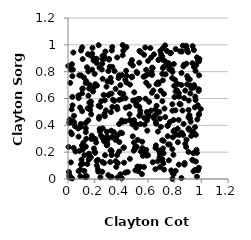
| Category | Series 0 |
|---|---|
| 0.7836342504068851 | 0.047 |
| 0.5610615064754484 | 0.173 |
| 0.04253485079842576 | 0.232 |
| 0.919891491295028 | 0.428 |
| 0.9515869209305778 | 0.534 |
| 0.5205785303169262 | 0.093 |
| 0.3262155400384781 | 0.637 |
| 0.6446854060187953 | 0.929 |
| 0.535160524778381 | 0.538 |
| 0.5935872876621674 | 0.779 |
| 0.534909024585252 | 0.471 |
| 0.2595380502048091 | 0.747 |
| 0.8655837116887714 | 0.839 |
| 0.13361825662190904 | 0.35 |
| 0.6056085689123091 | 0.695 |
| 0.20532825203499436 | 0.297 |
| 0.1688141165076407 | 0.57 |
| 0.10783027642858285 | 0.672 |
| 0.8670050182637795 | 0.41 |
| 0.2764689434769459 | 0.586 |
| 0.13324119266326725 | 0.418 |
| 0.9051945486520051 | 0.585 |
| 0.25927888224184875 | 0.891 |
| 0.1350354829395176 | 0.013 |
| 0.8743601571822789 | 0.12 |
| 0.032825821279329315 | 0.767 |
| 0.30267499963031913 | 0.625 |
| 0.35803701581496883 | 0.133 |
| 0.5424560325676623 | 0.091 |
| 0.37026893233019714 | 0.519 |
| 0.7836252910030995 | 0.509 |
| 0.5458763430222952 | 0.206 |
| 0.2592710910028215 | 0.917 |
| 0.9817306644293472 | 0.084 |
| 0.36732922168364524 | 0.537 |
| 0.23712059282582626 | 0.372 |
| 0.9587434187647836 | 0.33 |
| 0.9112938751995172 | 0.475 |
| 0.18794761554298456 | 0.652 |
| 0.5696512092485299 | 0.089 |
| 0.9761535961713298 | 0.066 |
| 0.1330325787023337 | 0.716 |
| 0.8441632748105674 | 0.557 |
| 0.09441787526968488 | 0.07 |
| 0.42963028463660735 | 0.739 |
| 0.25678347864624784 | 0.859 |
| 0.9414454121000605 | 0.058 |
| 0.6870681243370528 | 0.164 |
| 0.4718904579547721 | 0.865 |
| 0.5366587110782195 | 0.597 |
| 0.7826272741505005 | 0.223 |
| 0.21505620234439843 | 0.896 |
| 0.12257094637206437 | 0.06 |
| 0.19162183388206872 | 0.883 |
| 0.012228305892225474 | 0.443 |
| 0.08497778606495338 | 0.773 |
| 0.24195788789625264 | 0.539 |
| 0.7277438120638807 | 0.878 |
| 0.9528020199710424 | 0.067 |
| 0.3569627657817646 | 0.672 |
| 0.7164248464082997 | 0.285 |
| 0.836388045261852 | 0.329 |
| 0.1811758119070041 | 0.933 |
| 0.6593713744134111 | 0.251 |
| 0.1716184984122249 | 0.162 |
| 0.7079854282561578 | 0.147 |
| 0.887742561320369 | 0.86 |
| 0.8225464070149779 | 0.374 |
| 0.9399253503604587 | 0.192 |
| 0.5014864261002099 | 0.224 |
| 0.6222263062255006 | 0.509 |
| 0.32364193463691143 | 0.722 |
| 0.6884708741459176 | 0.192 |
| 0.7629904270691321 | 0.257 |
| 0.47453201417991225 | 0.431 |
| 0.22683987868806646 | 0.055 |
| 0.5422198982311248 | 0.51 |
| 0.426711481232801 | 0.981 |
| 0.0363782953368485 | 0.815 |
| 0.11040940128148442 | 0.675 |
| 0.024563854678855294 | 0.422 |
| 0.9332771118689898 | 0.863 |
| 0.1425951003818985 | 0.833 |
| 0.1528863314693442 | 0.621 |
| 0.2842890452612577 | 0.511 |
| 0.2035293773101309 | 0.195 |
| 0.7915133482140569 | 0.354 |
| 0.16709836890116866 | 0.921 |
| 0.2606591528599608 | 0.302 |
| 0.9510864196329474 | 0.838 |
| 0.0068524915121784885 | 0.052 |
| 0.5860361646602784 | 0.813 |
| 0.7677849466444505 | 0.937 |
| 0.9666299757965925 | 0.194 |
| 0.28061807326948657 | 0.95 |
| 0.7716873250788094 | 0.94 |
| 0.5544413713032634 | 0.037 |
| 0.5704808339654581 | 0.926 |
| 0.48020988595019376 | 0.763 |
| 0.5424256246201633 | 0.487 |
| 0.09738600316323406 | 0.389 |
| 0.572227929431 | 0.456 |
| 0.13409205110806047 | 0.241 |
| 0.5741111100016631 | 0.406 |
| 0.6642555693954686 | 0.707 |
| 0.3263997372313648 | 0.179 |
| 0.9637957779567464 | 0.217 |
| 0.38332390357631213 | 0.41 |
| 0.3222127745733256 | 0.498 |
| 0.11057872092615294 | 0.893 |
| 0.514640309522878 | 0.799 |
| 0.4634987756782277 | 0.44 |
| 0.8859332826750396 | 0.239 |
| 0.9044468148687503 | 0.515 |
| 0.7813589759911069 | 0.753 |
| 0.3271241369876705 | 0.209 |
| 0.07926225807148951 | 0.316 |
| 0.7782652049029435 | 0.816 |
| 0.12295453079391357 | 0.177 |
| 0.05287051434511445 | 0.393 |
| 0.24312128135219788 | 0.013 |
| 0.9488324230369898 | 0.688 |
| 0.14986530997600658 | 0.93 |
| 0.4031088951298152 | 0.597 |
| 0.9238090531202623 | 0.321 |
| 0.5867123418497034 | 0.217 |
| 0.6964143117082784 | 0.389 |
| 0.9670014349147732 | 0.017 |
| 0.27689757736042014 | 0.898 |
| 0.3599441634581176 | 0.305 |
| 0.33191755539467765 | 0.984 |
| 0.626387371202488 | 0.8 |
| 0.15204545936819508 | 0.438 |
| 0.9038742301631937 | 0.202 |
| 0.23610347014046976 | 0.831 |
| 0.822017863629243 | 0.708 |
| 0.3924261134031154 | 0.699 |
| 0.558306492502851 | 0.23 |
| 0.5149265396519943 | 0.58 |
| 0.5176370904666233 | 0.589 |
| 0.42974661900107014 | 0.979 |
| 0.6670209246698613 | 0.615 |
| 0.5093509846798908 | 0.383 |
| 0.5045507806778612 | 0.24 |
| 0.34670697953051716 | 0.582 |
| 0.4295321046530319 | 0.047 |
| 0.7109127055608829 | 0.975 |
| 0.27300403250683014 | 0.485 |
| 0.08605168220441656 | 0.209 |
| 0.356038258137315 | 0.292 |
| 0.38294355092932697 | 0.773 |
| 0.22474986976422578 | 0.142 |
| 0.04010199040089313 | 0.943 |
| 0.45983457942006795 | 0.54 |
| 0.27650658375352605 | 0.468 |
| 0.8699822472818761 | 0.852 |
| 0.497074842817009 | 0.646 |
| 0.0038043331004514657 | 0.239 |
| 0.6007583573000377 | 0.49 |
| 0.9035387737002814 | 0.371 |
| 0.011265466623986585 | 0.012 |
| 0.9589785983469751 | 0.13 |
| 0.4045433981877948 | 0.774 |
| 0.7111208629227787 | 0.735 |
| 0.19267030536697924 | 0.9 |
| 0.11062912517734452 | 0.22 |
| 0.5248580293881849 | 0.059 |
| 0.7826408919828249 | 0.557 |
| 0.10637519694739099 | 0.982 |
| 0.8244402500037893 | 0.274 |
| 0.8069233034270423 | 0.653 |
| 0.7157932103250816 | 0.117 |
| 0.27068111821212815 | 0.282 |
| 0.11917764597801551 | 0.757 |
| 0.6558796176243049 | 0.52 |
| 0.7077905228257287 | 0.58 |
| 0.14047513848605342 | 0.021 |
| 0.9526415718387587 | 0.387 |
| 0.5913401305096545 | 0.499 |
| 0.43116478059100316 | 0.601 |
| 0.4950841686361935 | 0.271 |
| 0.9386814635409755 | 0.139 |
| 0.029537385042505714 | 0.856 |
| 0.9456350514796672 | 0.834 |
| 0.8509923986562751 | 0.79 |
| 0.37900394316934943 | 0.752 |
| 0.16095330313955886 | 0.161 |
| 0.30201675527551675 | 0.029 |
| 0.8076945644307832 | 0.968 |
| 0.6646597859041016 | 0.545 |
| 0.15744548934908492 | 0.189 |
| 0.24775471328107587 | 0.323 |
| 0.3370061595321673 | 0.59 |
| 0.020875380017094484 | 0.124 |
| 0.3080688869714902 | 0.894 |
| 0.4862811628049438 | 0.845 |
| 0.29387610097104483 | 0.311 |
| 0.9061629733746279 | 0.465 |
| 0.894010690356628 | 0.767 |
| 0.9808833147173115 | 0.478 |
| 0.5258243181658103 | 0.596 |
| 0.1779391125006688 | 0.323 |
| 0.830052390853189 | 0.44 |
| 0.33210449940518355 | 0.538 |
| 0.029109592936268813 | 0.334 |
| 0.1043956518891998 | 0.249 |
| 0.7832945805680482 | 0.001 |
| 0.137033969581061 | 0.3 |
| 0.9252480836839286 | 0.677 |
| 0.5948156221365792 | 0.36 |
| 0.020671301865685266 | 0.815 |
| 0.7236874126608916 | 0.525 |
| 0.5210233719876468 | 0.585 |
| 0.29556580904234137 | 0.728 |
| 0.6073837001314768 | 0.468 |
| 0.747674768510308 | 0.397 |
| 0.030766748163459173 | 0.004 |
| 0.7914551010198689 | 0.034 |
| 0.31070712364972564 | 0.632 |
| 0.19043989199974506 | 0.679 |
| 0.0776470600537082 | 0.622 |
| 0.4833674373762689 | 0.407 |
| 0.4321514121701264 | 0.43 |
| 0.40329635216126025 | 0.006 |
| 0.7903863762593618 | 0.181 |
| 0.983289768368837 | 0.485 |
| 0.3682420418985082 | 0.178 |
| 0.656448835549177 | 0.231 |
| 0.7571899881519264 | 0.139 |
| 0.3196776894422961 | 0.753 |
| 0.7071372236132467 | 0.784 |
| 0.032231023727963735 | 0.612 |
| 0.4480596518510241 | 0.052 |
| 0.8142284959996465 | 0.331 |
| 0.5566579636884914 | 0.278 |
| 0.4620873290035026 | 0.483 |
| 0.13683002631151178 | 0.729 |
| 0.09793165447313347 | 0.772 |
| 0.8506292046891571 | 0.701 |
| 0.9459363964329232 | 0.7 |
| 0.22963656057598392 | 0.546 |
| 0.6586767920812567 | 0.422 |
| 0.09054605069815674 | 0.533 |
| 0.5586132850935173 | 0.201 |
| 0.19438967130145224 | 0.227 |
| 0.11004782452228187 | 0.114 |
| 0.21771461373087958 | 0.697 |
| 0.2939422891401281 | 0.254 |
| 0.011116534933453137 | 0.029 |
| 0.009561432556851145 | 0.419 |
| 0.9181570681134394 | 0.697 |
| 0.2952332722569556 | 0.262 |
| 0.3622599260689898 | 0.09 |
| 0.46942206476297443 | 0.862 |
| 0.8163182794573406 | 0.662 |
| 0.30254392220840254 | 0.805 |
| 0.24861002457858328 | 0.58 |
| 0.8414550526376748 | 0.951 |
| 0.7076231807522518 | 0.912 |
| 0.5753966364717134 | 0.765 |
| 0.7834935146353175 | 0.798 |
| 0.9798926652995741 | 0.657 |
| 0.631451038389089 | 0.776 |
| 0.3238526098112166 | 0.36 |
| 0.14704951873048597 | 0.527 |
| 0.6357622402391256 | 0.125 |
| 0.485762752329635 | 0.318 |
| 0.3934970571628466 | 0.035 |
| 0.5360260167401752 | 0.954 |
| 0.8792576307999055 | 0.262 |
| 0.6176272079697361 | 0.976 |
| 0.7744894800922796 | 0.064 |
| 0.16214986758787187 | 0.703 |
| 0.8076150535889263 | 0.06 |
| 0.9827387801510663 | 0.878 |
| 0.38477771535704586 | 0.275 |
| 0.5887300335160209 | 0.175 |
| 0.8638256686011576 | 0.328 |
| 0.9544741743800916 | 0.614 |
| 0.786495014297598 | 0.311 |
| 0.10971632531939149 | 0.225 |
| 0.21523876223251712 | 0.865 |
| 0.8058321510309349 | 0.512 |
| 0.74930701337199 | 0.844 |
| 0.40993693811176357 | 0.426 |
| 0.46463743531469526 | 0.15 |
| 0.4146175567214275 | 0.635 |
| 0.6845077318387539 | 0.5 |
| 0.25735218318324266 | 0.054 |
| 0.18338893733346037 | 0.977 |
| 0.04508362697099221 | 0.471 |
| 0.10587039386459116 | 0.505 |
| 0.9130370049301854 | 0.743 |
| 0.41849046821893376 | 0.236 |
| 0.17099103703002952 | 0.547 |
| 0.6294981507672247 | 0.643 |
| 0.6399102883799391 | 0.66 |
| 0.034326803451311824 | 0.549 |
| 0.9733237524440608 | 0.55 |
| 0.09611389683674065 | 0.108 |
| 0.5668498267320204 | 0.763 |
| 0.8590916988243759 | 0.51 |
| 0.34307233451632424 | 0.35 |
| 0.6002995255284508 | 0.88 |
| 0.03485596745401002 | 0.43 |
| 0.6000120827016069 | 0.177 |
| 0.8883311571375736 | 0.292 |
| 0.8998021200401852 | 0.746 |
| 0.8714863055593917 | 0.603 |
| 0.8863345188830059 | 0.993 |
| 0.505204595065919 | 0.065 |
| 0.3839770685992716 | 0.589 |
| 0.6459274577924962 | 0.452 |
| 0.40301203937959607 | 0.437 |
| 0.01986275523304815 | 0.348 |
| 0.02757475492894427 | 0.519 |
| 0.4929877831620017 | 0.211 |
| 0.6742079605107384 | 0.354 |
| 0.8542350902843547 | 0.95 |
| 0.3067165514737481 | 0.89 |
| 0.05614428223756075 | 0.205 |
| 0.7208203279104927 | 0.07 |
| 0.6348876664146957 | 0.827 |
| 0.1658752466094719 | 0.515 |
| 0.15606638771267828 | 0.145 |
| 0.7515539334960832 | 0.258 |
| 0.07951421797629563 | 0.059 |
| 0.7987692504677983 | 0.611 |
| 0.6083626464276656 | 0.575 |
| 0.6957788288965371 | 0.658 |
| 0.9154256852626704 | 0.452 |
| 0.934849076437791 | 0.99 |
| 0.001971498184763978 | 0.843 |
| 0.23209863155457722 | 0.45 |
| 0.3275375072178403 | 0.016 |
| 0.32859965557557064 | 0.958 |
| 0.74657109487378 | 0.397 |
| 0.9175619117875875 | 0.638 |
| 0.8923870244972278 | 0.967 |
| 0.42062131397238933 | 0.121 |
| 0.6908586851012376 | 0.089 |
| 0.27785416876000524 | 0.177 |
| 0.13333907593864286 | 0.377 |
| 0.7290016197606954 | 0.462 |
| 0.015999263000622595 | 0.716 |
| 0.6755522267737167 | 0.72 |
| 0.7971269301336773 | 0.363 |
| 0.48827786832133285 | 0.585 |
| 0.900369261120439 | 0.945 |
| 0.15231710128810444 | 0.802 |
| 0.20483547931032337 | 0.707 |
| 0.38385212265724045 | 0.205 |
| 0.4380386401323191 | 0.983 |
| 0.29089622239394547 | 0.352 |
| 0.4401506565661471 | 0.769 |
| 0.43810780754677964 | 0.72 |
| 0.25342757364578644 | 0.816 |
| 0.8024134783565795 | 0.739 |
| 0.3714870645836961 | 0.011 |
| 0.23449132653130433 | 0.464 |
| 0.47923551367935796 | 0.886 |
| 0.9812466354209001 | 0.669 |
| 0.6795025389477755 | 0.71 |
| 0.09741453643930545 | 0.958 |
| 0.6606601854283898 | 0.482 |
| 0.8366246261355161 | 0.56 |
| 0.22435986271987046 | 0.073 |
| 0.6555589572320099 | 0.073 |
| 0.2722372027504745 | 0.915 |
| 0.4793396374968392 | 0.758 |
| 0.7602361683636253 | 0.817 |
| 0.9955339351905771 | 0.522 |
| 0.3690103086457127 | 0.906 |
| 0.33058117631188005 | 0.313 |
| 0.5971461074333165 | 0.488 |
| 0.19982772624681816 | 0.205 |
| 0.5800145223323931 | 0.208 |
| 0.9830620072830832 | 0.773 |
| 0.7126669711366619 | 0.227 |
| 0.31741322337328937 | 0.014 |
| 0.9394495089573958 | 0.681 |
| 0.49557655183310584 | 0.438 |
| 0.31644144969928206 | 0.126 |
| 0.6805829128887977 | 0.213 |
| 0.229666526117614 | 0.997 |
| 0.6231315161519567 | 0.905 |
| 0.6779829160776755 | 0.887 |
| 0.15846892749206637 | 0.674 |
| 0.9324883476857415 | 0.142 |
| 0.9564943325231634 | 0.805 |
| 0.7111732133163785 | 0.827 |
| 0.2388440702161063 | 0.355 |
| 0.2886191118984286 | 0.689 |
| 0.9567957305134505 | 0.589 |
| 0.6445238366253782 | 0.468 |
| 0.5234454104440447 | 0.292 |
| 0.6893609479028185 | 0.45 |
| 0.04643220531507209 | 0.424 |
| 0.12650754980639978 | 0.015 |
| 0.43587057830357 | 0.807 |
| 0.7063332935236595 | 0.289 |
| 0.9051071676487742 | 0.376 |
| 0.3491766466247901 | 0.804 |
| 0.9615070427740815 | 0.849 |
| 0.5108293222304686 | 0.407 |
| 0.5130371872011856 | 0.548 |
| 0.4098415640140913 | 0.922 |
| 0.7192818947883346 | 0.634 |
| 0.519291955696966 | 0.79 |
| 0.8510188713138795 | 0.007 |
| 0.14486268010399658 | 0.112 |
| 0.7966647080222824 | 0.694 |
| 0.2918633944896065 | 0.318 |
| 0.2983903902334566 | 0.294 |
| 0.5344461514137832 | 0.867 |
| 0.7286999989163859 | 0.996 |
| 0.4164264531628249 | 0.232 |
| 0.5470133654801188 | 0.945 |
| 0.8790461850417728 | 0.659 |
| 0.9701485739486181 | 0.444 |
| 0.7644148686742077 | 0.425 |
| 0.01158039009140572 | 0.021 |
| 0.701505586864028 | 0.141 |
| 0.5128095623886411 | 0.559 |
| 0.2165814944949066 | 0.1 |
| 0.25897065452556345 | 0.127 |
| 0.07997223718519768 | 0.603 |
| 0.5159304371260436 | 0.24 |
| 0.9041525811744945 | 0.458 |
| 0.7916304873208345 | 0.44 |
| 0.6722298878657669 | 0.132 |
| 0.2601758401538865 | 0.377 |
| 0.7538297399931094 | 0.864 |
| 0.320131581456971 | 0.212 |
| 0.6252028992684789 | 0.779 |
| 0.39344308634775876 | 0.345 |
| 0.7937097884037322 | 0.857 |
| 0.3326022490258549 | 0.836 |
| 0.37328608246058914 | 0.119 |
| 0.4102362748149963 | 0.998 |
| 0.8738210756769265 | 0.107 |
| 0.8532102021586129 | 0.345 |
| 0.6926793703814828 | 0.955 |
| 0.5792013647339288 | 0.98 |
| 0.10144403277134023 | 0.144 |
| 0.6312778928246892 | 0.83 |
| 0.8612509808391116 | 0.994 |
| 0.27026013310816804 | 0.119 |
| 0.31257964420499995 | 0.837 |
| 0.07662700820930103 | 0.376 |
| 0.17386160458881356 | 0.482 |
| 0.566923493061812 | 0.188 |
| 0.01558935754225271 | 0.013 |
| 0.5322453930975702 | 0.086 |
| 0.8934441970933539 | 0.705 |
| 0.3229753572124319 | 0.214 |
| 0.7628934866413731 | 0.852 |
| 0.5423162637853994 | 0.409 |
| 0.504413717400398 | 0.588 |
| 0.7320886296840892 | 0.78 |
| 0.9739981729310551 | 0.883 |
| 0.10554676560184122 | 0.638 |
| 0.20007928498606195 | 0.783 |
| 0.2903466818943175 | 0.251 |
| 0.21475347582665127 | 0.135 |
| 0.16021703363591924 | 0.569 |
| 0.9441684711239051 | 0.961 |
| 0.6614541474555633 | 0.412 |
| 0.705170185454414 | 0.891 |
| 0.21140255330884325 | 0.272 |
| 0.19222932809925006 | 0.305 |
| 0.3714154500113298 | 0.326 |
| 0.592645067977561 | 0.438 |
| 0.9854180417297533 | 0.895 |
| 0.7169943708335611 | 0.192 |
| 0.7483503414634712 | 0.319 |
| 0.18123943048185723 | 0.815 |
| 0.6823725835390538 | 0.892 |
| 0.4332191785916822 | 0.532 |
| 0.8313241039874203 | 0.107 |
| 0.09297976074042347 | 0.02 |
| 0.17179126059709837 | 0.577 |
| 0.4147505930607594 | 0.956 |
| 0.11549984542328902 | 0.271 |
| 0.7426464821326727 | 0.954 |
| 0.6980739285314226 | 0.929 |
| 0.7190856529747726 | 0.836 |
| 0.5860660948107018 | 0.718 |
| 0.39091931686871295 | 0.642 |
| 0.5813429600122704 | 0.598 |
| 0.83094216911585 | 0.64 |
| 0.4646876431827747 | 0.704 |
| 0.8336542819663011 | 0.614 |
| 0.17611335182882548 | 0.298 |
| 0.2670158940328051 | 0.627 |
| 0.9192570893660379 | 0.36 |
| 0.40567952060982543 | 0.342 |
| 0.9418404584471044 | 0.348 |
| 0.9677120217070115 | 0.907 |
| 0.0960679114253818 | 0.411 |